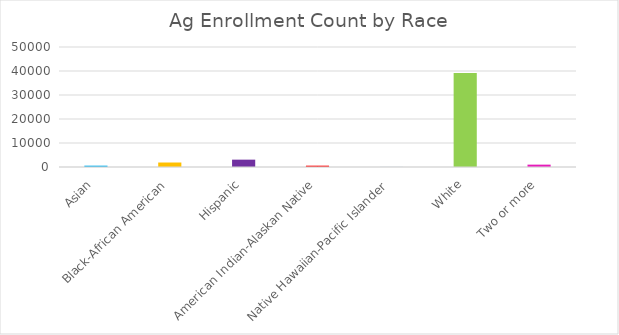
| Category | Count |
|---|---|
| Asian | 562 |
| Black-African American | 1872 |
| Hispanic | 3060 |
| American Indian-Alaskan Native | 560 |
| Native Hawaiian-Pacific Islander | 31 |
| White | 39115 |
| Two or more | 985 |